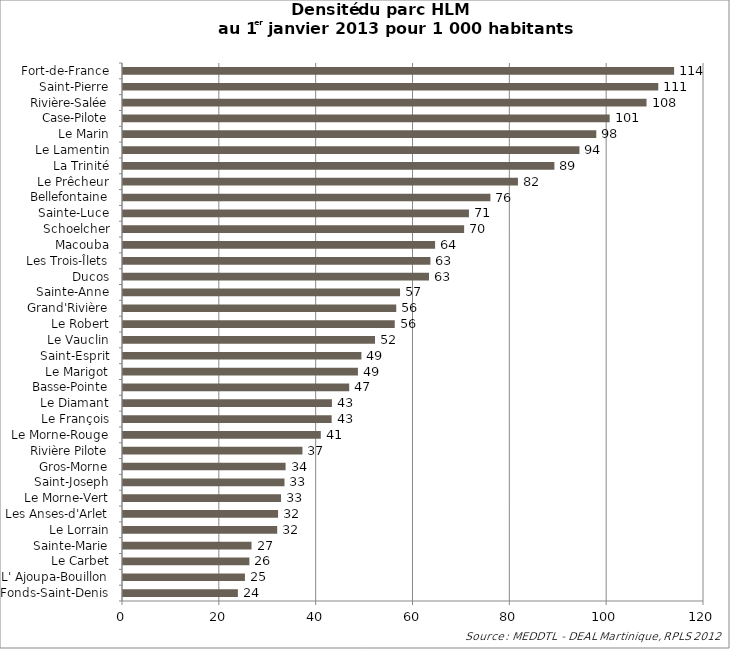
| Category | Series 0 |
|---|---|
| Fonds-Saint-Denis | 23.725 |
| L' Ajoupa-Bouillon | 25.186 |
| Le Carbet | 26.105 |
| Sainte-Marie | 26.542 |
| Le Lorrain | 31.849 |
| Les Anses-d'Arlet | 32.025 |
| Le Morne-Vert | 32.638 |
| Saint-Joseph | 33.355 |
| Gros-Morne | 33.585 |
| Rivière Pilote | 37.06 |
| Le Morne-Rouge | 40.849 |
| Le François | 43.098 |
| Le Diamant | 43.154 |
| Basse-Pointe | 46.721 |
| Le Marigot | 48.522 |
| Saint-Esprit | 49.239 |
| Le Vauclin | 52.053 |
| Le Robert | 56.127 |
| Grand'Rivière | 56.437 |
| Sainte-Anne | 57.222 |
| Ducos | 63.201 |
| Les Trois-Îlets | 63.494 |
| Macouba | 64.46 |
| Schoelcher | 70.457 |
| Sainte-Luce | 71.45 |
| Bellefontaine | 75.881 |
| Le Prêcheur | 81.571 |
| La Trinité | 89.1 |
| Le Lamentin | 94.277 |
| Le Marin | 97.755 |
| Case-Pilote | 100.517 |
| Rivière-Salée | 108.129 |
| Saint-Pierre | 110.555 |
| Fort-de-France | 113.829 |